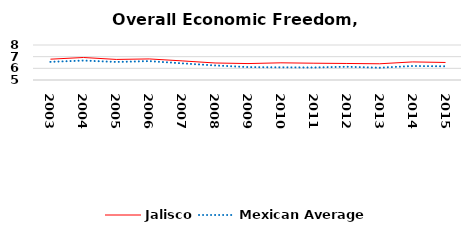
| Category | Jalisco | Mexican Average  |
|---|---|---|
| 2003.0 | 6.784 | 6.552 |
| 2004.0 | 6.929 | 6.668 |
| 2005.0 | 6.763 | 6.546 |
| 2006.0 | 6.805 | 6.619 |
| 2007.0 | 6.638 | 6.428 |
| 2008.0 | 6.458 | 6.248 |
| 2009.0 | 6.408 | 6.106 |
| 2010.0 | 6.473 | 6.086 |
| 2011.0 | 6.439 | 6.074 |
| 2012.0 | 6.416 | 6.134 |
| 2013.0 | 6.391 | 6.054 |
| 2014.0 | 6.551 | 6.2 |
| 2015.0 | 6.502 | 6.174 |